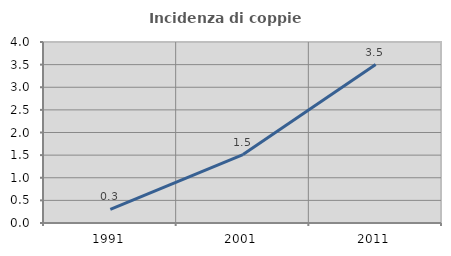
| Category | Incidenza di coppie miste |
|---|---|
| 1991.0 | 0.3 |
| 2001.0 | 1.513 |
| 2011.0 | 3.503 |